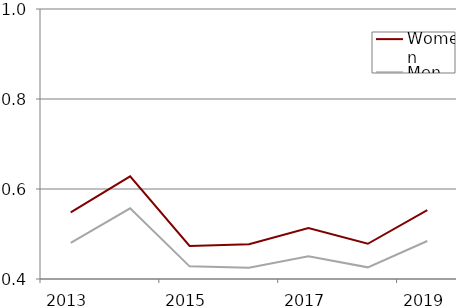
| Category | Women | Men |
|---|---|---|
| 2013.0 | 0.548 | 0.48 |
| 2014.0 | 0.628 | 0.557 |
| 2015.0 | 0.474 | 0.428 |
| 2016.0 | 0.477 | 0.425 |
| 2017.0 | 0.513 | 0.451 |
| 2018.0 | 0.478 | 0.426 |
| 2019.0 | 0.553 | 0.485 |